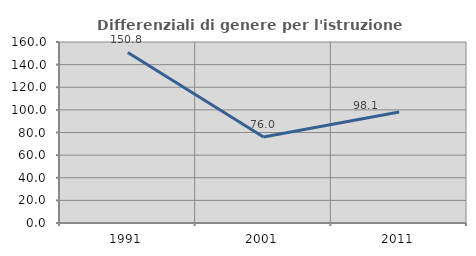
| Category | Differenziali di genere per l'istruzione superiore |
|---|---|
| 1991.0 | 150.8 |
| 2001.0 | 75.951 |
| 2011.0 | 98.077 |